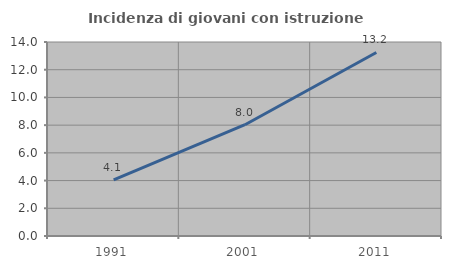
| Category | Incidenza di giovani con istruzione universitaria |
|---|---|
| 1991.0 | 4.054 |
| 2001.0 | 8.031 |
| 2011.0 | 13.245 |